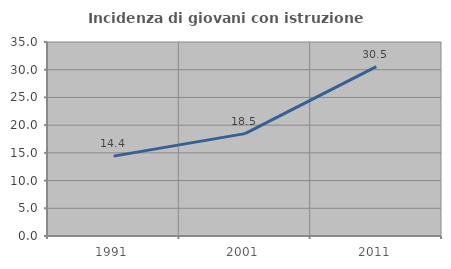
| Category | Incidenza di giovani con istruzione universitaria |
|---|---|
| 1991.0 | 14.413 |
| 2001.0 | 18.472 |
| 2011.0 | 30.544 |